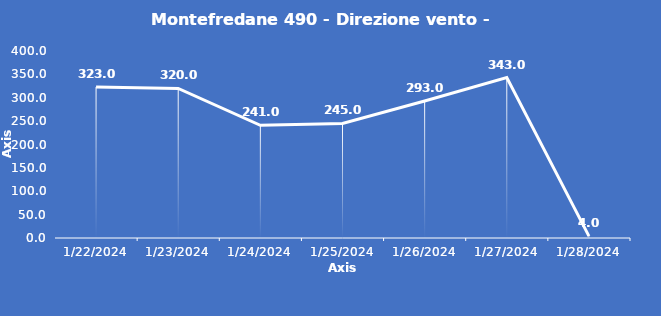
| Category | Montefredane 490 - Direzione vento - Grezzo (°N) |
|---|---|
| 1/22/24 | 323 |
| 1/23/24 | 320 |
| 1/24/24 | 241 |
| 1/25/24 | 245 |
| 1/26/24 | 293 |
| 1/27/24 | 343 |
| 1/28/24 | 4 |